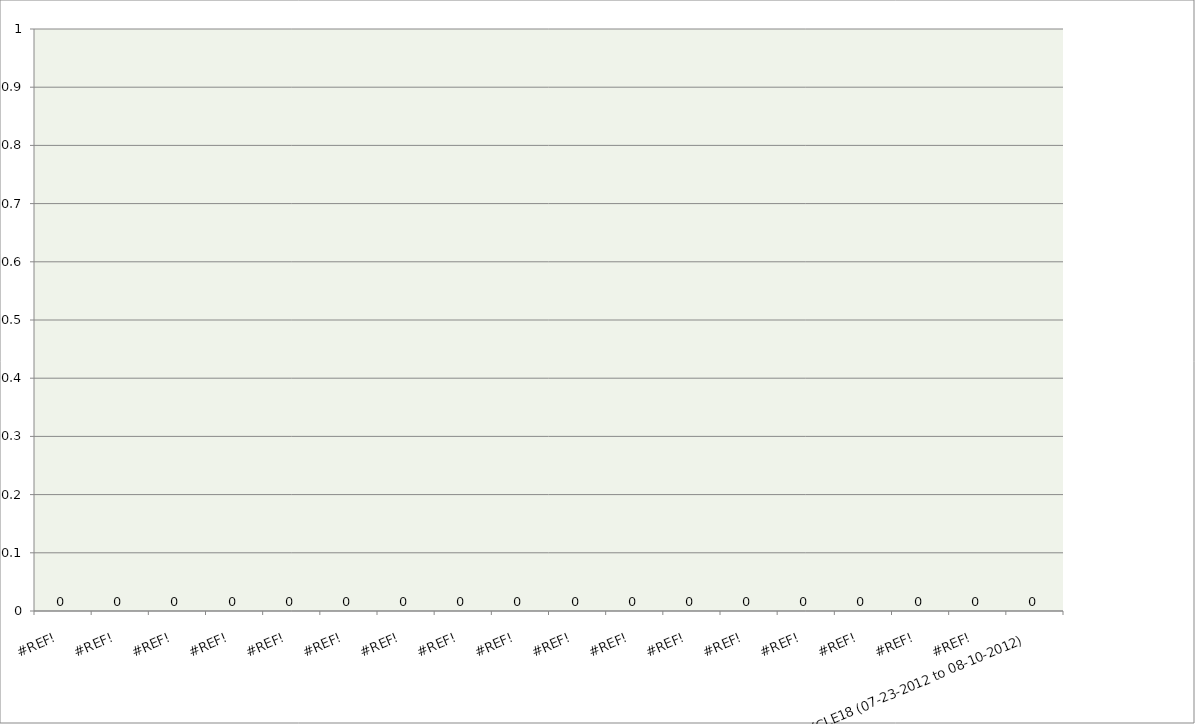
| Category | Series 0 |
|---|---|
| #REF! | 0 |
| #REF! | 0 |
| #REF! | 0 |
| #REF! | 0 |
| #REF! | 0 |
| #REF! | 0 |
| #REF! | 0 |
| #REF! | 0 |
| #REF! | 0 |
| #REF! | 0 |
| #REF! | 0 |
| #REF! | 0 |
| #REF! | 0 |
| #REF! | 0 |
| #REF! | 0 |
| #REF! | 0 |
| #REF! | 0 |
| CYCLE18 (07-23-2012 to 08-10-2012) | 0 |